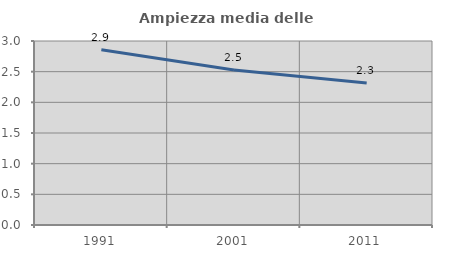
| Category | Ampiezza media delle famiglie |
|---|---|
| 1991.0 | 2.856 |
| 2001.0 | 2.527 |
| 2011.0 | 2.315 |